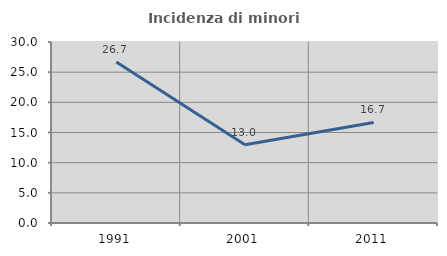
| Category | Incidenza di minori stranieri |
|---|---|
| 1991.0 | 26.667 |
| 2001.0 | 12.963 |
| 2011.0 | 16.667 |